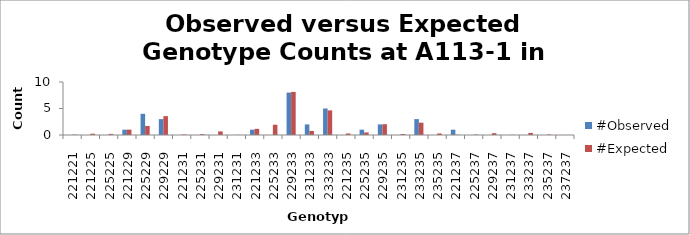
| Category | #Observed | #Expected |
|---|---|---|
| 221221.0 | 0 | 0.073 |
| 221225.0 | 0 | 0.242 |
| 225225.0 | 0 | 0.202 |
| 221229.0 | 1 | 1.016 |
| 225229.0 | 4 | 1.694 |
| 229229.0 | 3 | 3.556 |
| 221231.0 | 0 | 0.097 |
| 225231.0 | 0 | 0.161 |
| 229231.0 | 0 | 0.677 |
| 231231.0 | 0 | 0.032 |
| 221233.0 | 1 | 1.161 |
| 225233.0 | 0 | 1.935 |
| 229233.0 | 8 | 8.129 |
| 231233.0 | 2 | 0.774 |
| 233233.0 | 5 | 4.645 |
| 221235.0 | 0 | 0.29 |
| 225235.0 | 1 | 0.484 |
| 229235.0 | 2 | 2.032 |
| 231235.0 | 0 | 0.194 |
| 233235.0 | 3 | 2.323 |
| 235235.0 | 0 | 0.29 |
| 221237.0 | 1 | 0.048 |
| 225237.0 | 0 | 0.081 |
| 229237.0 | 0 | 0.339 |
| 231237.0 | 0 | 0.032 |
| 233237.0 | 0 | 0.387 |
| 235237.0 | 0 | 0.097 |
| 237237.0 | 0 | 0.008 |